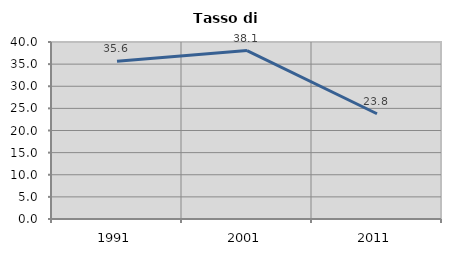
| Category | Tasso di disoccupazione   |
|---|---|
| 1991.0 | 35.624 |
| 2001.0 | 38.055 |
| 2011.0 | 23.782 |